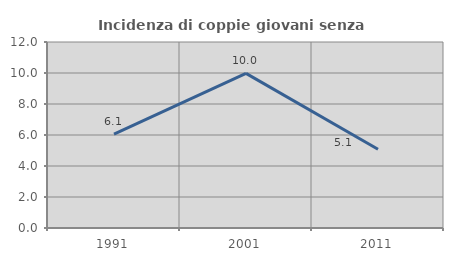
| Category | Incidenza di coppie giovani senza figli |
|---|---|
| 1991.0 | 6.051 |
| 2001.0 | 9.978 |
| 2011.0 | 5.078 |